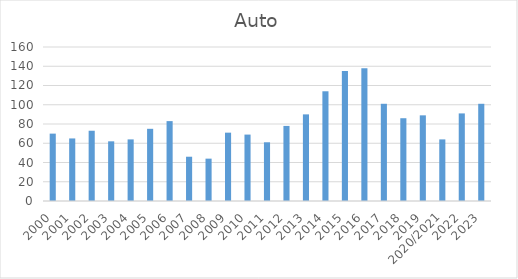
| Category | Auto |
|---|---|
| 2000 | 70 |
| 2001 | 65 |
| 2002 | 73 |
| 2003 | 62 |
| 2004 | 64 |
| 2005 | 75 |
| 2006 | 83 |
| 2007 | 46 |
| 2008 | 44 |
| 2009 | 71 |
| 2010 | 69 |
| 2011 | 61 |
| 2012 | 78 |
| 2013 | 90 |
| 2014 | 114 |
| 2015 | 135 |
| 2016 | 138 |
| 2017 | 101 |
| 2018 | 86 |
| 2019 | 89 |
| 2020/2021 | 64 |
| 2022 | 91 |
| 2023 | 101 |